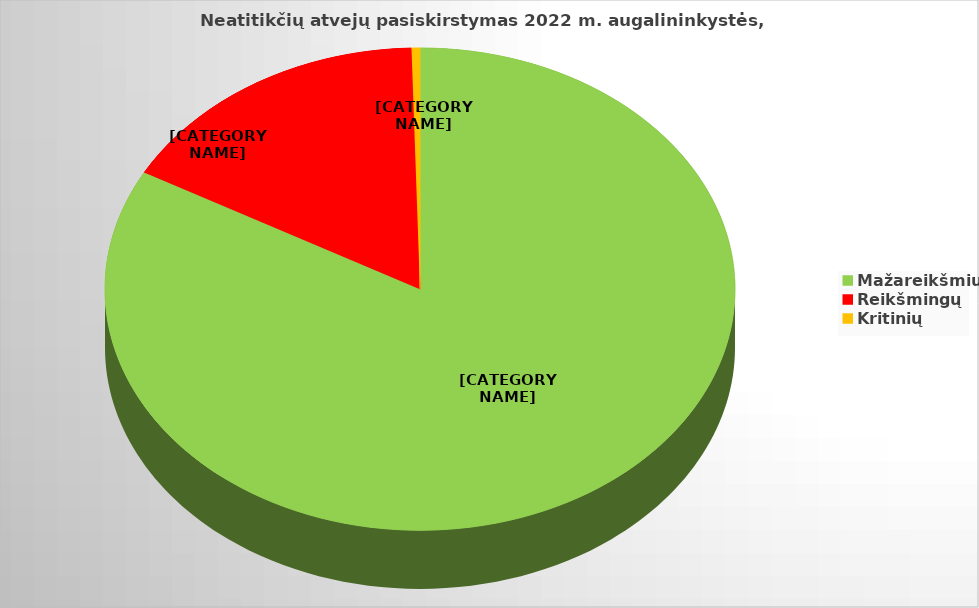
| Category | Procentai |
|---|---|
| Mažareikšmių | 83.027 |
| Reikšmingų | 16.543 |
| Kritinių | 0.43 |